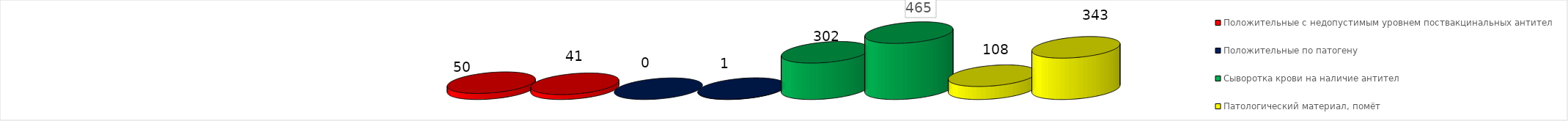
| Category | Положительные с недопустимым уровнем поствакцинальных антител | Положительные по патогену | Сыворотка крови на наличие антител | Патологический материал, помёт |
|---|---|---|---|---|
| Сыворотка крови на наличие антител | 41 | 1 | 465 | 343 |